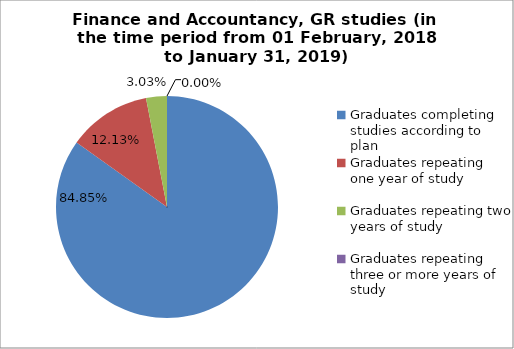
| Category | Series 0 |
|---|---|
| Graduates completing studies according to plan | 84.848 |
| Graduates repeating one year of study | 12.121 |
| Graduates repeating two years of study | 3.03 |
| Graduates repeating three or more years of study | 0 |